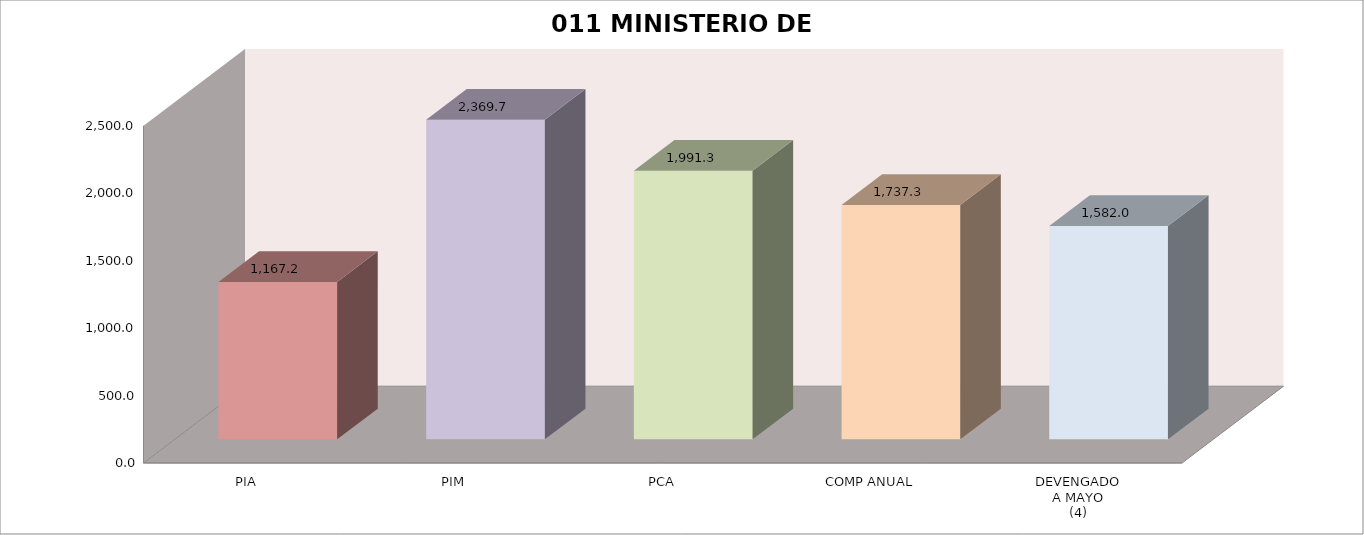
| Category | 011 MINISTERIO DE SALUD |
|---|---|
| PIA | 1167.209 |
| PIM | 2369.652 |
| PCA | 1991.296 |
| COMP ANUAL | 1737.29 |
| DEVENGADO
A MAYO
(4) | 1581.979 |